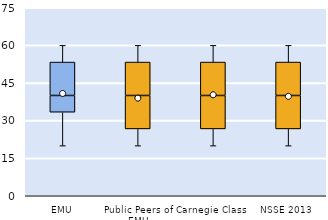
| Category | 25th | 50th | 75th |
|---|---|---|---|
| EMU | 33.333 | 6.667 | 13.333 |
| Public Peers of EMU | 26.667 | 13.333 | 13.333 |
| Carnegie Class | 26.667 | 13.333 | 13.333 |
| NSSE 2013 | 26.667 | 13.333 | 13.333 |